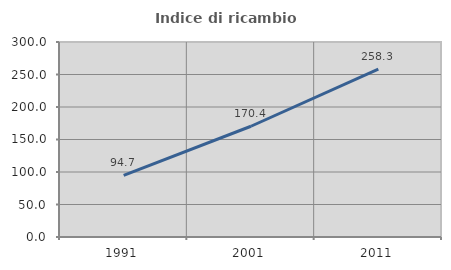
| Category | Indice di ricambio occupazionale  |
|---|---|
| 1991.0 | 94.702 |
| 2001.0 | 170.38 |
| 2011.0 | 258.333 |